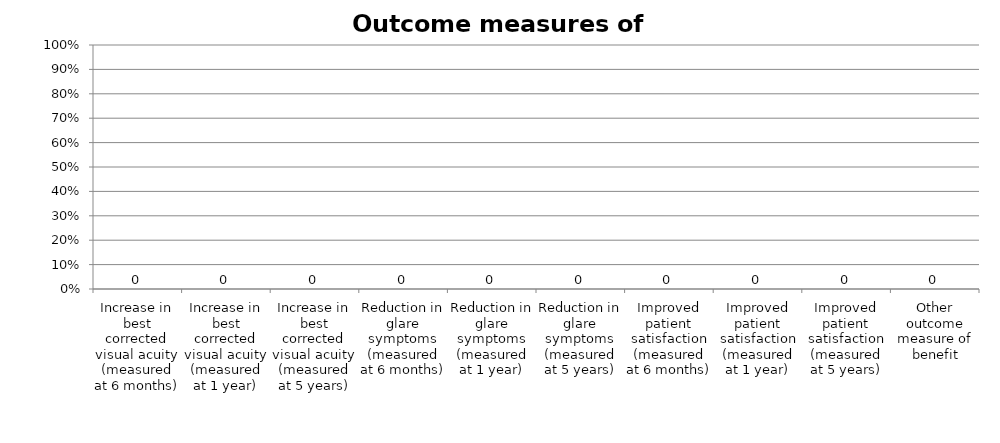
| Category | Series 0 |
|---|---|
| Increase in best corrected visual acuity (measured at 6 months) | 0 |
| Increase in best corrected visual acuity (measured at 1 year) | 0 |
| Increase in best corrected visual acuity (measured at 5 years) | 0 |
| Reduction in glare symptoms (measured at 6 months) | 0 |
| Reduction in glare symptoms (measured at 1 year) | 0 |
| Reduction in glare symptoms (measured at 5 years) | 0 |
| Improved patient satisfaction (measured at 6 months) | 0 |
| Improved patient satisfaction (measured at 1 year) | 0 |
| Improved patient satisfaction (measured at 5 years) | 0 |
| Other outcome measure of benefit | 0 |